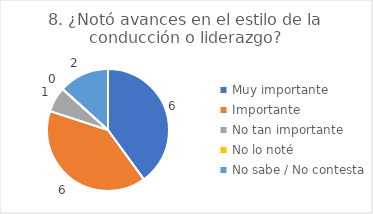
| Category | 8. ¿Notó avances en el estilo de la conducción o liderazgo? |
|---|---|
| Muy importante  | 0.4 |
| Importante  | 0.4 |
| No tan importante  | 0.067 |
| No lo noté  | 0 |
| No sabe / No contesta | 0.133 |